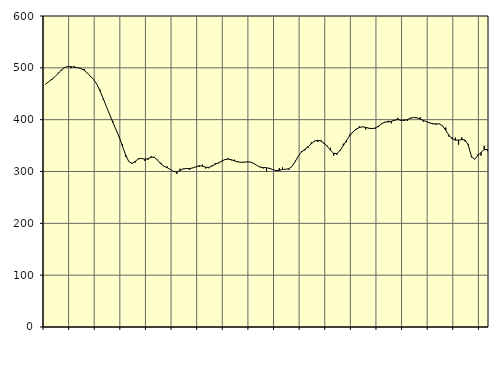
| Category | Piggar | Series 1 |
|---|---|---|
| nan | 468.3 | 468.64 |
| 87.0 | 473.2 | 473.27 |
| 87.0 | 477.1 | 478.19 |
| 87.0 | 483.4 | 483.36 |
| nan | 490.8 | 489.68 |
| 88.0 | 494.7 | 496.19 |
| 88.0 | 501.2 | 500.78 |
| 88.0 | 502.7 | 502.53 |
| nan | 499.3 | 502.12 |
| 89.0 | 503.5 | 501.16 |
| 89.0 | 499.8 | 500.27 |
| 89.0 | 499.3 | 498.77 |
| nan | 497.6 | 495.47 |
| 90.0 | 489.7 | 490.11 |
| 90.0 | 482.4 | 484.08 |
| 90.0 | 477.3 | 477.71 |
| nan | 468.5 | 468.56 |
| 91.0 | 458 | 455.62 |
| 91.0 | 438.8 | 440.61 |
| 91.0 | 425.5 | 425.21 |
| nan | 411 | 409.83 |
| 92.0 | 397.8 | 394.76 |
| 92.0 | 380.7 | 380.79 |
| 92.0 | 367.4 | 366.3 |
| nan | 352.6 | 349.25 |
| 93.0 | 328.4 | 331.86 |
| 93.0 | 319 | 319.08 |
| 93.0 | 314.9 | 315.53 |
| nan | 317.2 | 319.54 |
| 94.0 | 326.1 | 324.34 |
| 94.0 | 326.1 | 325.11 |
| 94.0 | 320.3 | 323.64 |
| nan | 322.6 | 324.79 |
| 95.0 | 329.4 | 327.69 |
| 95.0 | 328.2 | 327.28 |
| 95.0 | 322.7 | 321.52 |
| nan | 317.1 | 314.54 |
| 96.0 | 309.4 | 310.06 |
| 96.0 | 309.7 | 307.35 |
| 96.0 | 304.1 | 303.87 |
| nan | 300.6 | 299.99 |
| 97.0 | 295.4 | 299.1 |
| 97.0 | 305.3 | 301.93 |
| 97.0 | 305.7 | 304.98 |
| nan | 306.2 | 305.72 |
| 98.0 | 302.9 | 305.65 |
| 98.0 | 307 | 306.85 |
| 98.0 | 309.4 | 309.2 |
| nan | 309 | 311.21 |
| 99.0 | 313.3 | 310.31 |
| 99.0 | 305.6 | 308.15 |
| 99.0 | 306.2 | 307.92 |
| nan | 312.2 | 310.54 |
| 0.0 | 316.4 | 313.99 |
| 0.0 | 315.7 | 316.63 |
| 0.0 | 318.9 | 320.03 |
| nan | 323.8 | 323.02 |
| 1.0 | 325.5 | 323.99 |
| 1.0 | 321.6 | 322.84 |
| 1.0 | 322.8 | 320.55 |
| nan | 319.3 | 318.61 |
| 2.0 | 318.2 | 317.76 |
| 2.0 | 317.4 | 317.99 |
| 2.0 | 319.2 | 318.65 |
| nan | 318.4 | 318.16 |
| 3.0 | 315 | 315.73 |
| 3.0 | 311.8 | 311.75 |
| 3.0 | 308 | 308.57 |
| nan | 305.7 | 307.58 |
| 4.0 | 300.3 | 307.25 |
| 4.0 | 304.8 | 306.07 |
| 4.0 | 303.2 | 303.57 |
| nan | 302.6 | 301.65 |
| 5.0 | 306.5 | 302.21 |
| 5.0 | 307.8 | 303.84 |
| 5.0 | 304.4 | 304.35 |
| nan | 303.3 | 305.25 |
| 6.0 | 309.8 | 310.14 |
| 6.0 | 320.8 | 319.67 |
| 6.0 | 330.7 | 330.3 |
| nan | 339.5 | 337.97 |
| 7.0 | 340.7 | 342.98 |
| 7.0 | 345.6 | 347.82 |
| 7.0 | 356.2 | 353.62 |
| nan | 359.4 | 358.57 |
| 8.0 | 356.9 | 360.25 |
| 8.0 | 360.4 | 358.8 |
| 8.0 | 353 | 354.66 |
| nan | 349.6 | 348.44 |
| 9.0 | 345.7 | 340.89 |
| 9.0 | 330.8 | 334.98 |
| 9.0 | 332.3 | 334.72 |
| nan | 339.6 | 340.75 |
| 10.0 | 353.7 | 350.02 |
| 10.0 | 356.6 | 359.98 |
| 10.0 | 371.2 | 368.96 |
| nan | 376.6 | 376.46 |
| 11.0 | 380 | 381.63 |
| 11.0 | 387.4 | 384.91 |
| 11.0 | 385.9 | 386.22 |
| nan | 381.3 | 385.11 |
| 12.0 | 383 | 383.48 |
| 12.0 | 383.7 | 382.77 |
| 12.0 | 382.6 | 383.99 |
| nan | 385.7 | 387.49 |
| 13.0 | 393.1 | 392.34 |
| 13.0 | 395.6 | 395.27 |
| 13.0 | 397.8 | 395.64 |
| nan | 393 | 396.81 |
| 14.0 | 397.9 | 399.08 |
| 14.0 | 403.5 | 400.08 |
| 14.0 | 397.4 | 399 |
| nan | 400.2 | 398.5 |
| 15.0 | 397.5 | 400.34 |
| 15.0 | 403.8 | 402.82 |
| 15.0 | 403.8 | 404.24 |
| nan | 403.4 | 403.53 |
| 16.0 | 404.7 | 401.1 |
| 16.0 | 396 | 398.51 |
| 16.0 | 395.7 | 396.06 |
| nan | 393.3 | 393.66 |
| 17.0 | 391.2 | 392.07 |
| 17.0 | 390 | 391.9 |
| 17.0 | 392.2 | 391.77 |
| nan | 387.5 | 387.94 |
| 18.0 | 384.8 | 379.33 |
| 18.0 | 367.2 | 369.87 |
| 18.0 | 366 | 363.12 |
| nan | 365.4 | 360.45 |
| 19.0 | 351.8 | 360.64 |
| 19.0 | 365.9 | 361.52 |
| 19.0 | 358 | 360.75 |
| nan | 353.3 | 351.49 |
| 20.0 | 327.3 | 329.3 |
| 20.0 | 324.2 | 323.58 |
| 20.0 | 332.5 | 330.6 |
| nan | 330.6 | 336.73 |
| 21.0 | 349.6 | 342.15 |
| 21.0 | 339.2 | 342.55 |